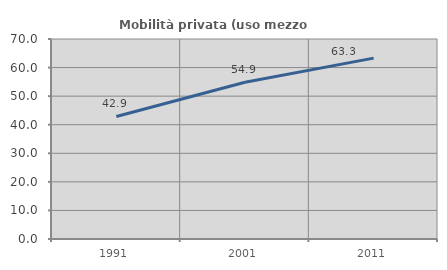
| Category | Mobilità privata (uso mezzo privato) |
|---|---|
| 1991.0 | 42.896 |
| 2001.0 | 54.876 |
| 2011.0 | 63.306 |